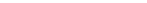
| Category | Quatre principaux opérateurs | #REF! |
|---|---|---|
| 0 | 1 | 1 |